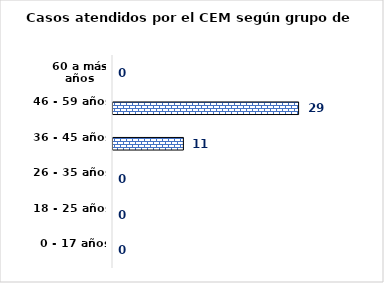
| Category | Series 0 |
|---|---|
| 0 - 17 años | 0 |
| 18 - 25 años | 0 |
| 26 - 35 años | 0 |
| 36 - 45 años | 11 |
| 46 - 59 años | 29 |
| 60 a más años | 0 |